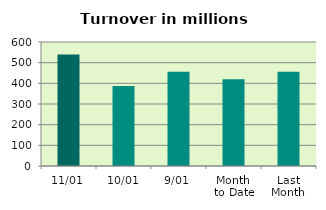
| Category | Series 0 |
|---|---|
| 11/01 | 539.728 |
| 10/01 | 387.566 |
| 9/01 | 456.623 |
| Month 
to Date | 419.791 |
| Last
Month | 455.699 |